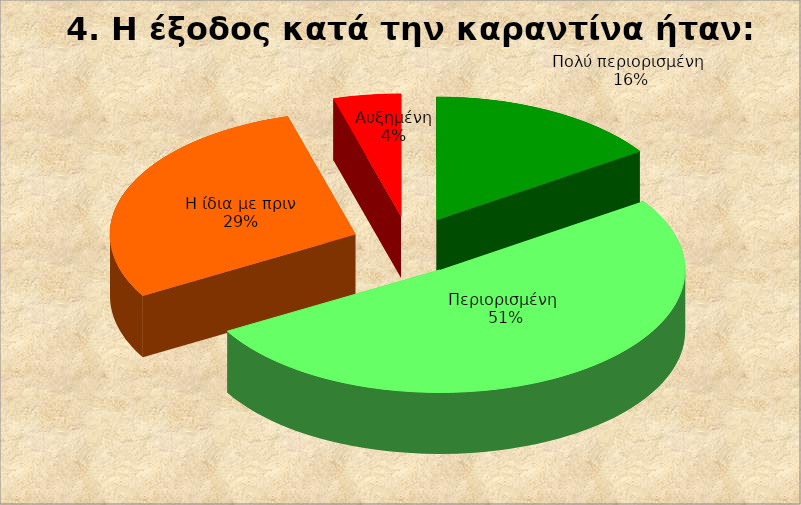
| Category | Series 0 |
|---|---|
| Πολύ περιορισμένη  | 7 |
| Περιορισμένη  | 23 |
| Η ίδια με πριν | 13 |
| Αυξημένη | 2 |